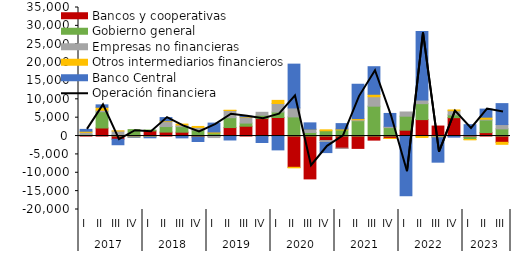
| Category | Bancos y cooperativas | Gobierno general | Empresas no financieras | Otros intermediarios financieros | Banco Central |
|---|---|---|---|---|---|
| 0 | 176.525 | 291.94 | 552.774 | 291.309 | 500.031 |
| 1 | 2191.03 | 4434.382 | 396.373 | 816.648 | 657.32 |
| 2 | -866.634 | 335.819 | 1034.76 | 24.218 | -1500.259 |
| 3 | 269.332 | 1484.954 | -199.227 | -72.585 | -26.614 |
| 4 | 1397.801 | 235.632 | -83.56 | -138.035 | -252.82 |
| 5 | 1077.762 | 1504.673 | 1356.124 | 214.215 | 872.22 |
| 6 | 1052.846 | 1509.857 | 448.531 | 245.563 | -495.87 |
| 7 | -306.499 | 1625.849 | 723.919 | 266.304 | -1185.782 |
| 8 | -21.106 | 828.073 | -393.541 | 266.297 | 2429.827 |
| 9 | 2308.815 | 2686.164 | 1961.172 | 72.613 | -1071.366 |
| 10 | 2677.373 | 853.875 | 1582.22 | 145.283 | 142.172 |
| 11 | 4750.727 | 906.93 | 808.038 | -131.251 | -1619.017 |
| 12 | 5043.509 | 1503.307 | 2309.269 | 854.352 | -3766.184 |
| 13 | -8509.202 | 5214.739 | 2437.834 | -146.454 | 11929.007 |
| 14 | -11666.258 | 962.307 | 874.227 | 21.263 | 1729.234 |
| 15 | -1230.751 | 1438.424 | -514.103 | 253.284 | -2759.208 |
| 16 | -3304.253 | 1670.011 | -20.372 | 261.36 | 1455.217 |
| 17 | -3361.381 | 4160.799 | 260.763 | 329.189 | 9354.292 |
| 18 | -1109.253 | 8132.548 | 2574.451 | 671.208 | 7500.376 |
| 19 | -639.184 | 2294.791 | 350.223 | -10.439 | 3508.969 |
| 20 | 1593.5 | 3814.868 | 1140.6 | -89.462 | -16162.137 |
| 21 | 4476.203 | 4344.794 | 984.301 | -380.579 | 18652.618 |
| 22 | 2721.849 | -170.501 | -143.069 | -124.108 | -6677.199 |
| 23 | 5005.331 | 765.426 | 1125.931 | 208.079 | -298.343 |
| 24 | -341.256 | -606.74 | 447.116 | -84.037 | 2650.399 |
| 25 | 932.248 | 3431.624 | 227.249 | 549.814 | 2195.225 |
| 26 | -1705.664 | 1952.324 | 1175.658 | -549.692 | 5699.787 |